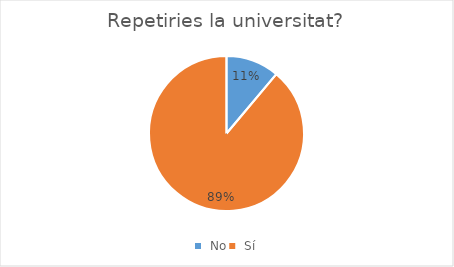
| Category | Series 0 |
|---|---|
|  No | 5 |
|  Sí | 40 |